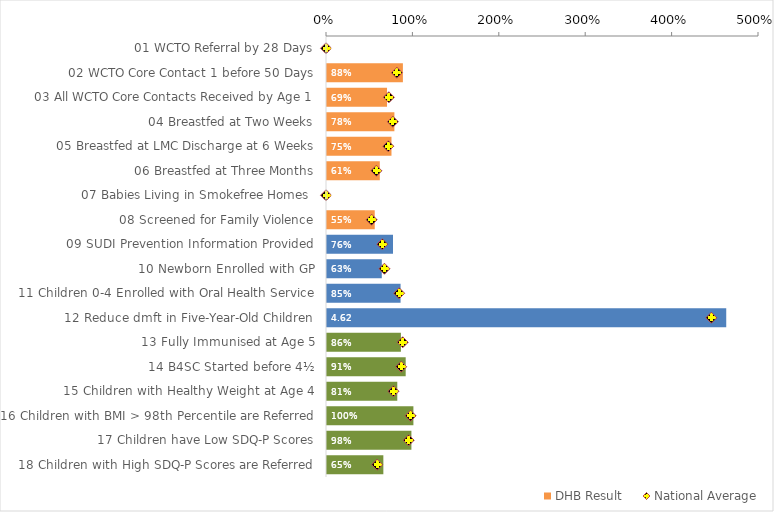
| Category | DHB Result |
|---|---|
| 01 WCTO Referral by 28 Days | 0 |
| 02 WCTO Core Contact 1 before 50 Days | 0.878 |
| 03 All WCTO Core Contacts Received by Age 1 | 0.695 |
| 04 Breastfed at Two Weeks | 0.78 |
| 05 Breastfed at LMC Discharge at 6 Weeks | 0.746 |
| 06 Breastfed at Three Months | 0.611 |
| 07 Babies Living in Smokefree Homes  | 0 |
| 08 Screened for Family Violence | 0.553 |
| 09 SUDI Prevention Information Provided | 0.764 |
| 10 Newborn Enrolled with GP | 0.634 |
| 11 Children 0-4 Enrolled with Oral Health Service | 0.852 |
| 12 Reduce dmft in Five-Year-Old Children | 4.621 |
| 13 Fully Immunised at Age 5 | 0.855 |
| 14 B4SC Started before 4½ | 0.911 |
| 15 Children with Healthy Weight at Age 4 | 0.813 |
| 16 Children with BMI > 98th Percentile are Referred | 1 |
| 17 Children have Low SDQ-P Scores | 0.977 |
| 18 Children with High SDQ-P Scores are Referred | 0.652 |